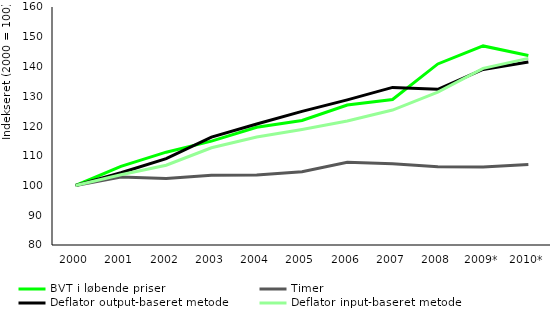
| Category | BVT i løbende priser | Timer | Deflator output-baseret metode | Deflator input-baseret metode |
|---|---|---|---|---|
| 2000 | 100 | 100 | 100 | 100 |
| 2001 | 106.422 | 102.818 | 104.279 | 103.6 |
| 2002 | 111.203 | 102.324 | 109.025 | 106.812 |
| 2003 | 114.925 | 103.466 | 116.277 | 112.686 |
| 2004 | 119.561 | 103.508 | 120.673 | 116.292 |
| 2005 | 121.877 | 104.653 | 124.907 | 118.851 |
| 2006 | 127.037 | 107.783 | 128.78 | 121.703 |
| 2007 | 128.905 | 107.346 | 132.979 | 125.354 |
| 2008 | 140.859 | 106.337 | 132.344 | 131.371 |
| 2009* | 146.913 | 106.242 | 139.022 | 139.385 |
| 2010* | 143.716 | 107.079 | 141.539 | 142.73 |